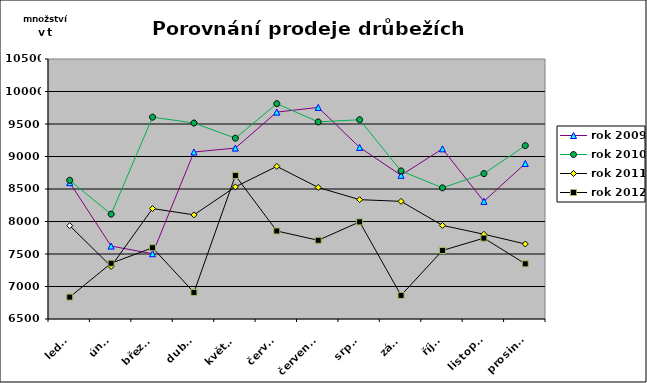
| Category | rok 2009 | rok 2010 | rok 2011 | rok 2012 |
|---|---|---|---|---|
| leden | 8598 | 8634 | 7936 | 6837 |
| únor | 7622 | 8113 | 7309 | 7357 |
| březen | 7504 | 9605 | 8199 | 7596 |
| duben | 9069 | 9515 | 8102 | 6909 |
| květen | 9130 | 9282 | 8533 | 8707 |
| červen | 9683 | 9813 | 8848 | 7854 |
| červenec | 9755 | 9532 | 8524 | 7711 |
| srpen | 9140 | 9566 | 8336 | 7994 |
| září | 8711 | 8778 | 8310 | 6863 |
| říjen | 9118 | 8518 | 7940 | 7554 |
| listopad | 8310 | 8737 | 7804 | 7744 |
| prosinec | 8893 | 9167 | 7654 | 7349 |